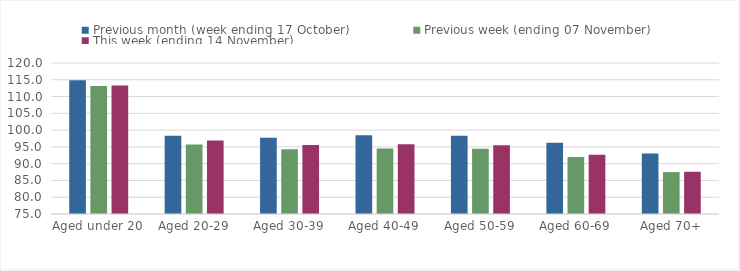
| Category | Previous month (week ending 17 October) | Previous week (ending 07 November) | This week (ending 14 November) |
|---|---|---|---|
| Aged under 20 | 114.86 | 113.18 | 113.29 |
| Aged 20-29 | 98.3 | 95.69 | 96.89 |
| Aged 30-39 | 97.73 | 94.3 | 95.53 |
| Aged 40-49 | 98.44 | 94.51 | 95.81 |
| Aged 50-59 | 98.29 | 94.46 | 95.51 |
| Aged 60-69 | 96.26 | 91.96 | 92.68 |
| Aged 70+ | 93.01 | 87.47 | 87.58 |